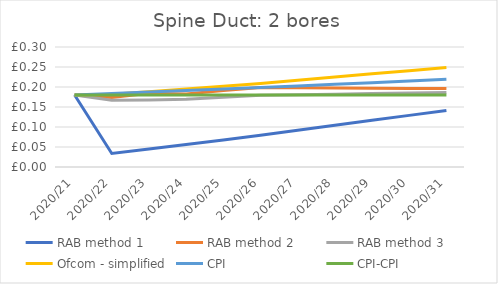
| Category | RAB method 1 | RAB method 2 | RAB method 3 | Ofcom - simplified | CPI | CPI-CPI |
|---|---|---|---|---|---|---|
| 2020/21 | 0.18 | 0.18 | 0.18 | 0.18 | 0.18 | 0.18 |
| 2020/22 | 0.034 | 0.174 | 0.167 | 0.182 | 0.184 | 0.18 |
| 2020/23 | 0.045 | 0.184 | 0.168 | 0.188 | 0.187 | 0.18 |
| 2020/24 | 0.056 | 0.182 | 0.17 | 0.195 | 0.191 | 0.18 |
| 2020/25 | 0.068 | 0.191 | 0.174 | 0.202 | 0.195 | 0.18 |
| 2020/26 | 0.08 | 0.198 | 0.179 | 0.209 | 0.199 | 0.18 |
| 2020/27 | 0.092 | 0.198 | 0.181 | 0.217 | 0.203 | 0.18 |
| 2020/28 | 0.104 | 0.197 | 0.182 | 0.225 | 0.207 | 0.18 |
| 2020/29 | 0.117 | 0.197 | 0.183 | 0.233 | 0.211 | 0.18 |
| 2020/30 | 0.129 | 0.196 | 0.185 | 0.241 | 0.215 | 0.18 |
| 2020/31 | 0.141 | 0.196 | 0.186 | 0.249 | 0.219 | 0.18 |